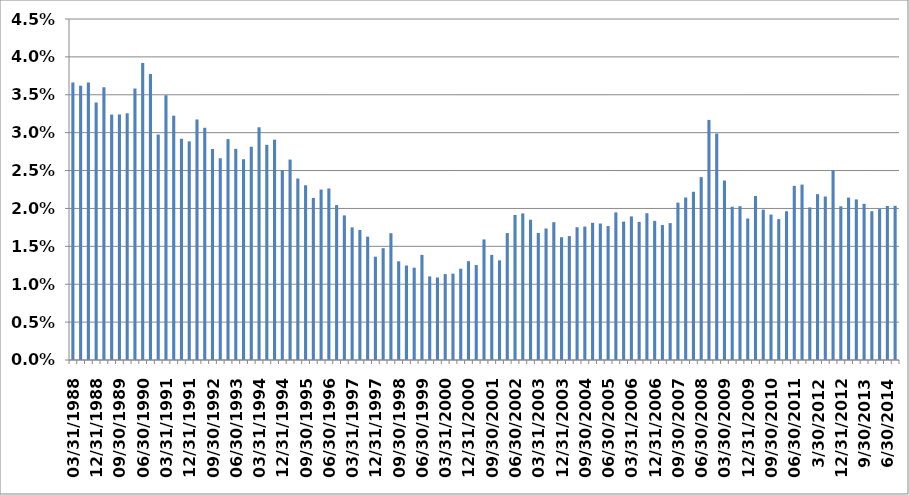
| Category | Series 0 |
|---|---|
| 03/31/1988 | 0.037 |
| 06/30/1988 | 0.036 |
| 09/30/1988 | 0.037 |
| 12/31/1988 | 0.034 |
| 03/31/1989 | 0.036 |
| 06/30/1989 | 0.032 |
| 09/30/1989 | 0.032 |
| 12/31/1989 | 0.033 |
| 03/31/1990 | 0.036 |
| 06/30/1990 | 0.039 |
| 09/30/1990 | 0.038 |
| 12/31/1990 | 0.03 |
| 03/31/1991 | 0.035 |
| 06/30/1991 | 0.032 |
| 09/30/1991 | 0.029 |
| 12/31/1991 | 0.029 |
| 03/31/1992 | 0.032 |
| 06/30/1992 | 0.031 |
| 09/30/1992 | 0.028 |
| 12/31/1992 | 0.027 |
| 03/31/1993 | 0.029 |
| 06/30/1993 | 0.028 |
| 09/30/1993 | 0.027 |
| 12/31/1993 | 0.028 |
| 03/31/1994 | 0.031 |
| 06/30/1994 | 0.028 |
| 09/30/1994 | 0.029 |
| 12/31/1994 | 0.025 |
| 03/31/1995 | 0.026 |
| 06/30/1995 | 0.024 |
| 09/30/1995 | 0.023 |
| 12/31/1995 | 0.021 |
| 03/31/1996 | 0.022 |
| 06/30/1996 | 0.023 |
| 09/30/1996 | 0.02 |
| 12/31/1996 | 0.019 |
| 03/31/1997 | 0.018 |
| 06/30/1997 | 0.017 |
| 09/30/1997 | 0.016 |
| 12/31/1997 | 0.014 |
| 03/31/1998 | 0.015 |
| 06/30/1998 | 0.017 |
| 09/30/1998 | 0.013 |
| 12/31/1998 | 0.012 |
| 03/31/1999 | 0.012 |
| 06/30/1999 | 0.014 |
| 09/30/1999 | 0.011 |
| 12/31/1999 | 0.011 |
| 03/31/2000 | 0.011 |
| 06/30/2000 | 0.011 |
| 09/30/2000 | 0.012 |
| 12/31/2000 | 0.013 |
| 03/31/2001 | 0.013 |
| 06/30/2001 | 0.016 |
| 09/30/2001 | 0.014 |
| 12/31/2001 | 0.013 |
| 03/31/2002 | 0.017 |
| 06/30/2002 | 0.019 |
| 09/30/2002 | 0.019 |
| 12/31/2002 | 0.018 |
| 03/31/2003 | 0.017 |
| 06/30/2003 | 0.017 |
| 09/30/2003 | 0.018 |
| 12/31/2003 | 0.016 |
| 03/31/2004  | 0.016 |
| 06/30/2004 | 0.018 |
| 09/30/2004 | 0.018 |
| 12/31/2004 | 0.018 |
| 03/31/2005 | 0.018 |
| 06/30/2005 | 0.018 |
| 09/30/2005 | 0.019 |
| 12/31/2005 | 0.018 |
| 03/31/2006 | 0.019 |
| 06/30/2006 | 0.018 |
| 09/30/2006 | 0.019 |
| 12/31/2006 | 0.018 |
| 03/31/2007 | 0.018 |
| 06/30/2007 | 0.018 |
| 09/30/2007 | 0.021 |
| 12/31/2007 | 0.021 |
| 03/31/2008 | 0.022 |
| 06/30/2008 | 0.024 |
| 09/30/2008 | 0.032 |
| 12/31/2008 | 0.03 |
| 03/30/2009 | 0.024 |
| 06/30/2009 | 0.02 |
| 09/30/2009 | 0.02 |
| 12/31/2009 | 0.019 |
| 03/31/2010 | 0.022 |
| 06/30/2010 | 0.02 |
| 09/30/2010 | 0.019 |
| 12/31/2010 | 0.019 |
| 03/31/2011 | 0.02 |
| 06/30/2011 | 0.023 |
| 09/30/2011 | 0.023 |
| 12/30/2011 | 0.02 |
| 3/30/2012 | 0.022 |
| 6/29/2012 | 0.022 |
| 9/28/2012 | 0.025 |
| 12/31/2012 | 0.02 |
| 3/28/2013 | 0.021 |
| 6/28/2013 | 0.021 |
| 9/30/2013 | 0.021 |
| 12/31/2013 | 0.02 |
| 3/31/2014 | 0.02 |
| 6/30/2014 | 0.02 |
| 9/30/2014 | 0.02 |